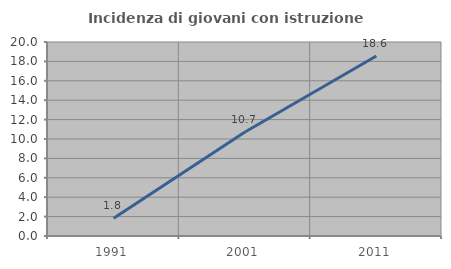
| Category | Incidenza di giovani con istruzione universitaria |
|---|---|
| 1991.0 | 1.832 |
| 2001.0 | 10.714 |
| 2011.0 | 18.558 |